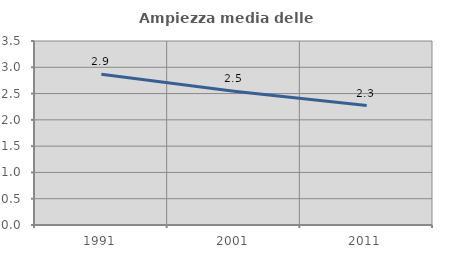
| Category | Ampiezza media delle famiglie |
|---|---|
| 1991.0 | 2.868 |
| 2001.0 | 2.544 |
| 2011.0 | 2.271 |